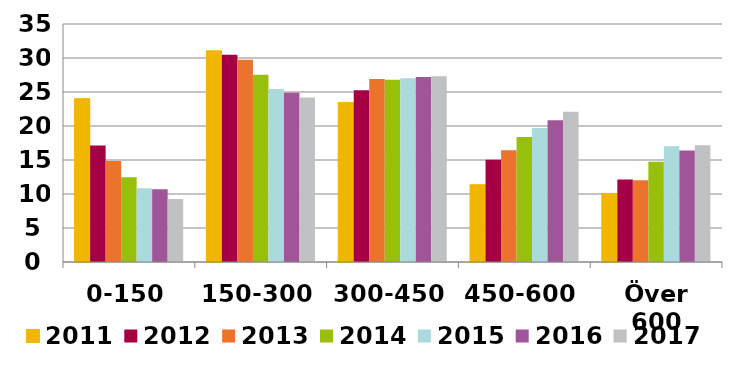
| Category | 2011 | 2012 | 2013 | 2014 | 2015 | 2016 | 2017 |
|---|---|---|---|---|---|---|---|
| 0-150 | 24.02 | 17.14 | 14.87 | 12.48 | 10.83 | 10.69 | 9.25 |
| 150-300 | 31.05 | 30.47 | 29.75 | 27.55 | 25.43 | 24.9 | 24.19 |
| 300-450 | 23.47 | 25.25 | 26.92 | 26.81 | 27.04 | 27.19 | 27.31 |
| 450-600 | 11.36 | 15.02 | 16.45 | 18.4 | 19.7 | 20.83 | 22.08 |
| Över 600 | 10.08 | 12.13 | 12.01 | 14.76 | 17.01 | 16.39 | 17.17 |